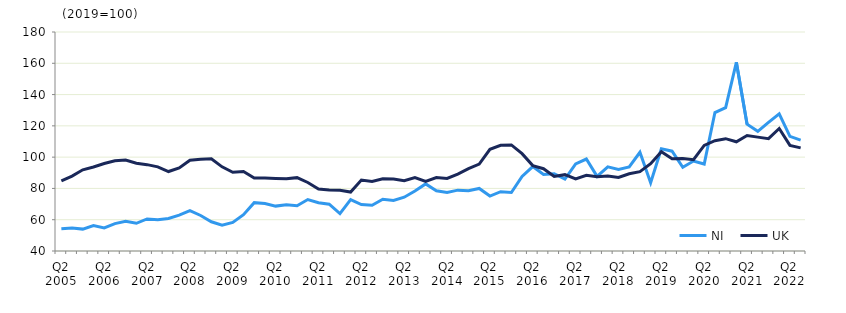
| Category | NI | UK  |
|---|---|---|
| Q2 2005 | 54.2 | 84.9 |
|  | 54.7 | 87.9 |
| Q4 2005 | 54 | 91.9 |
|  | 56.3 | 93.7 |
| Q2 2006 | 54.8 | 95.9 |
|  | 57.5 | 97.7 |
| Q4 2006 | 59 | 98.2 |
|  | 57.7 | 96.1 |
| Q2 2007 | 60.5 | 95.2 |
|  | 60 | 93.8 |
| Q4 2007 | 60.8 | 90.8 |
|  | 62.9 | 93.1 |
| Q2 2008 | 65.8 | 98 |
|  | 62.7 | 98.7 |
| Q4 2008 | 58.7 | 99 |
|  | 56.5 | 93.8 |
| Q2 2009 | 58.3 | 90.3 |
|  | 63.2 | 90.8 |
| Q4 2009 | 70.9 | 86.6 |
|  | 70.3 | 86.6 |
| Q2 2010 | 68.7 | 86.4 |
|  | 69.6 | 86.2 |
| Q4 2010 | 68.9 | 86.9 |
|  | 72.9 | 83.8 |
| Q2 2011 | 70.9 | 79.6 |
|  | 69.9 | 79 |
| Q4 2011 | 63.9 | 78.9 |
|  | 72.9 | 77.7 |
| Q2 2012 | 69.7 | 85.4 |
|  | 69.2 | 84.4 |
| Q4 2012 | 73.1 | 86.2 |
|  | 72.3 | 86 |
| Q2 2013 | 74.4 | 84.9 |
|  | 78.4 | 87 |
| Q4 2013 | 82.9 | 84.5 |
|  | 78.5 | 87 |
| Q2 2014 | 77.4 | 86.4 |
|  | 78.9 | 89.2 |
| Q4 2014 | 78.5 | 92.7 |
|  | 80 | 95.6 |
| Q2 2015 | 75.1 | 105 |
|  | 77.9 | 107.6 |
| Q4 2015 | 77.4 | 107.8 |
|  | 87.7 | 102.2 |
| Q2 2016 | 94 | 94.6 |
|  | 88.9 | 92.6 |
| Q4 2016 | 89.4 | 87.7 |
|  | 86 | 88.8 |
| Q2 2017 | 95.7 | 86.1 |
|  | 98.8 | 88.4 |
| Q4 2017 | 87.7 | 87.5 |
|  | 93.8 | 88 |
| Q2 2018 | 92.2 | 87 |
|  | 93.7 | 89.4 |
| Q4 2018 | 103.1 | 90.7 |
|  | 83.6 | 95.8 |
| Q2 2019 | 105.3 | 103.5 |
|  | 103.8 | 99 |
| Q4 2019 | 93.5 | 99.1 |
|  | 97.5 | 98.4 |
| Q2 2020 | 95.6 | 107.5 |
|  | 128.5 | 110.5 |
| Q4 2020 | 131.6 | 111.8 |
|  | 160.6 | 109.8 |
| Q2 2021 | 121.1 | 113.8 |
|  | 116.5 | 112.8 |
| Q4 2021 | 122.2 | 111.8 |
|  | 127.7 | 118.3 |
| Q2 2022 | 113.3 | 107.5 |